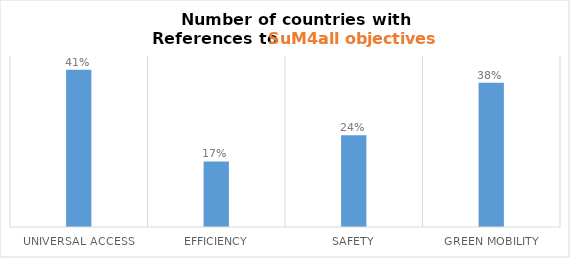
| Category | Series 0 |
|---|---|
| Universal Access | 0.414 |
| Efficiency | 0.172 |
| Safety | 0.241 |
| Green Mobility | 0.379 |